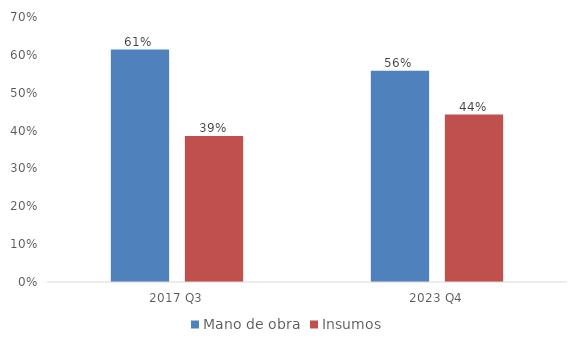
| Category | Mano de obra | Insumos |
|---|---|---|
| 2017 Q3 | 0.614 | 0.386 |
| 2023 Q4 | 0.558 | 0.442 |